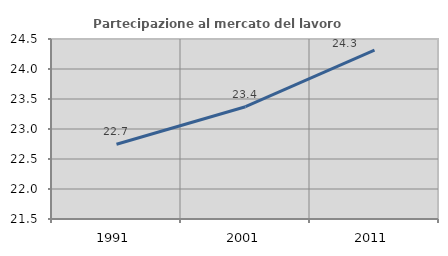
| Category | Partecipazione al mercato del lavoro  femminile |
|---|---|
| 1991.0 | 22.746 |
| 2001.0 | 23.371 |
| 2011.0 | 24.316 |